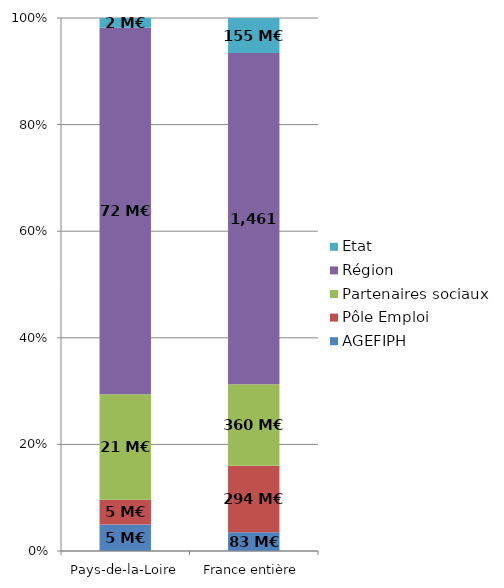
| Category | AGEFIPH | Pôle Emploi | Partenaires sociaux | Région | Etat |
|---|---|---|---|---|---|
| Pays-de-la-Loire | 5.2 | 4.851 | 20.664 | 71.872 | 1.907 |
| France entière | 82.716 | 293.959 | 359.593 | 1461.057 | 154.74 |